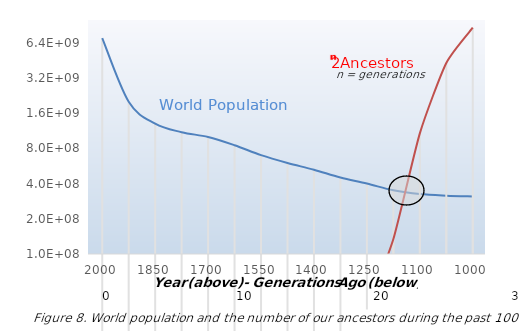
| Category | Series 0 | Series 1 |
|---|---|---|
| 2000.0 | 7000000000 | 1 |
| 1925.0 | 2000000000 | 8 |
| 1850.0 | 1300000000 | 32 |
| 1775.0 | 1100000000 | 128 |
| 1700.0 | 1000000000 | 1024 |
| 1625.0 | 850000000 | 8192 |
| 1550.0 | 700000000 | 32768 |
| 1475.0 | 600000000 | 131072 |
| 1400.0 | 525000000 | 1048576 |
| 1325.0 | 450000000 | 8388608 |
| 1250.0 | 400000000 | 33554432 |
| 1175.0 | 350000000 | 134217728 |
| 1100.0 | 325000000 | 1073741824 |
| 1025.0 | 315000000 | 4294967296 |
| 1000.0 | 310000000 | 8589934592 |